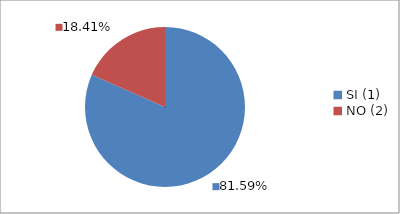
| Category | Series 0 |
|---|---|
| SI (1) | 0.816 |
| NO (2) | 0.184 |